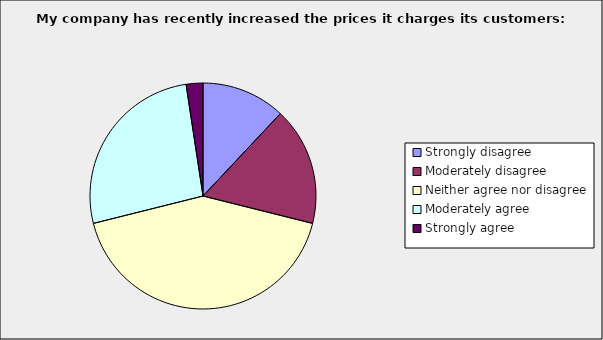
| Category | Series 0 |
|---|---|
| Strongly disagree | 0.12 |
| Moderately disagree | 0.169 |
| Neither agree nor disagree | 0.422 |
| Moderately agree | 0.265 |
| Strongly agree | 0.024 |